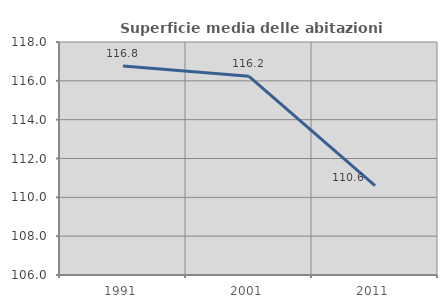
| Category | Superficie media delle abitazioni occupate |
|---|---|
| 1991.0 | 116.768 |
| 2001.0 | 116.232 |
| 2011.0 | 110.608 |